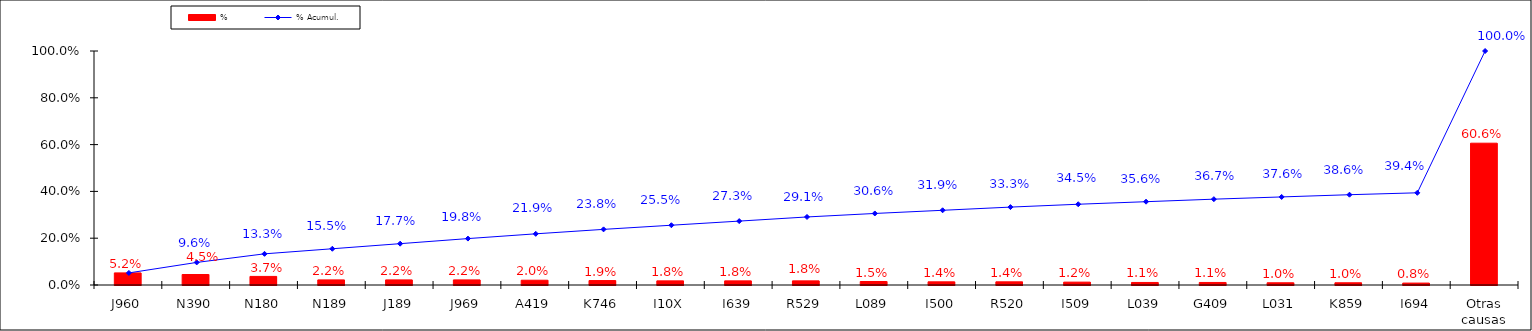
| Category | % |
|---|---|
| J960 | 0.052 |
| N390 | 0.045 |
| N180 | 0.037 |
| N189 | 0.022 |
| J189 | 0.022 |
| J969 | 0.022 |
| A419 | 0.02 |
| K746 | 0.019 |
| I10X | 0.018 |
| I639 | 0.018 |
| R529 | 0.018 |
| L089 | 0.015 |
| I500 | 0.014 |
| R520 | 0.014 |
| I509 | 0.012 |
| L039 | 0.011 |
| G409 | 0.011 |
| L031 | 0.01 |
| K859 | 0.01 |
| I694 | 0.008 |
| Otras causas | 0.606 |